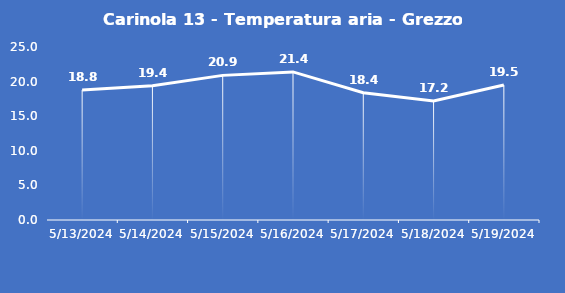
| Category | Carinola 13 - Temperatura aria - Grezzo (°C) |
|---|---|
| 5/13/24 | 18.8 |
| 5/14/24 | 19.4 |
| 5/15/24 | 20.9 |
| 5/16/24 | 21.4 |
| 5/17/24 | 18.4 |
| 5/18/24 | 17.2 |
| 5/19/24 | 19.5 |